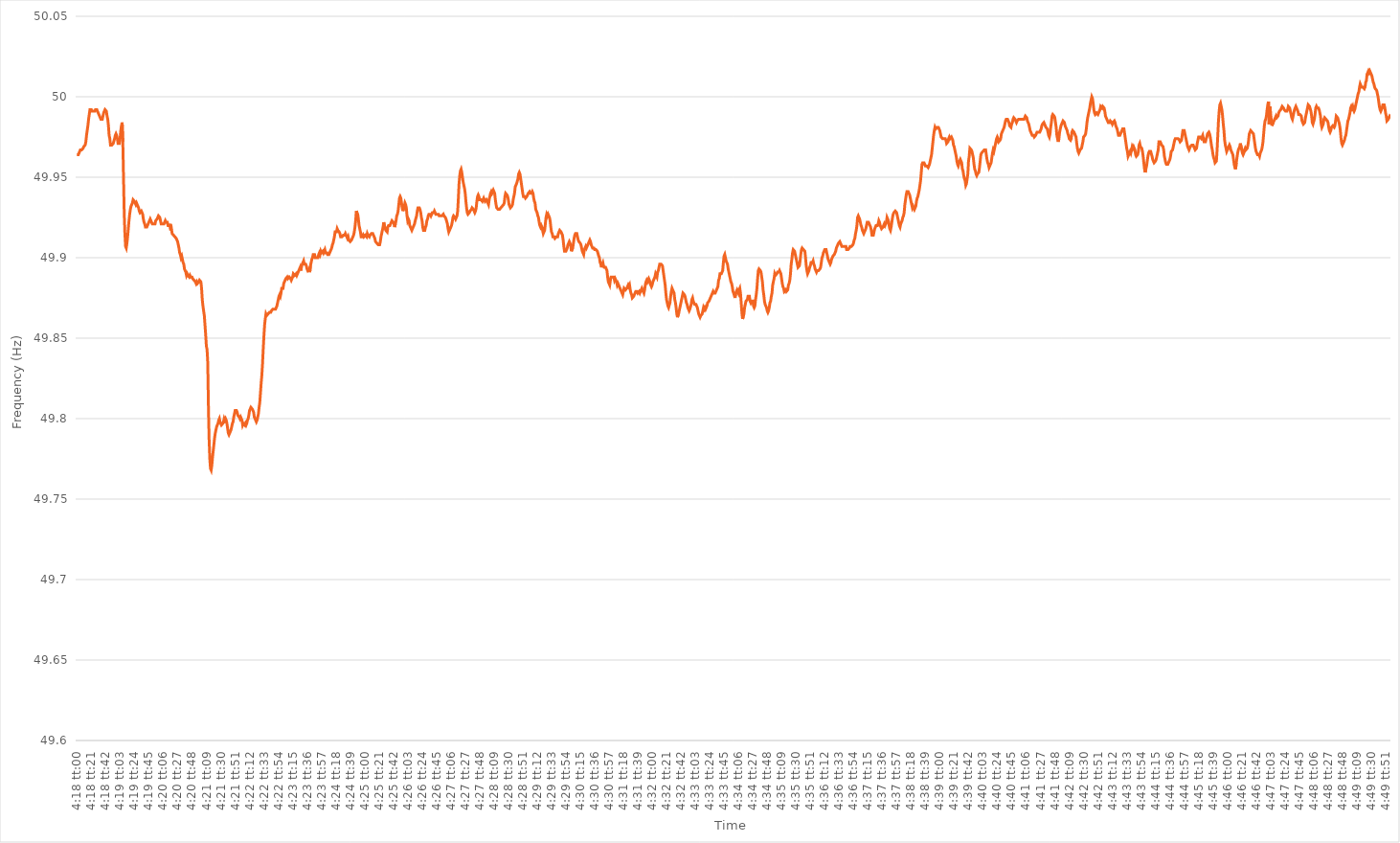
| Category | Series 0 |
|---|---|
| 0.17916666666666667 | 49.964 |
| 0.17917824074074074 | 49.964 |
| 0.1791898148148148 | 49.964 |
| 0.1792013888888889 | 49.965 |
| 0.17921296296296296 | 49.966 |
| 0.17922453703703703 | 49.967 |
| 0.17923611111111112 | 49.967 |
| 0.1792476851851852 | 49.967 |
| 0.17925925925925926 | 49.967 |
| 0.17927083333333335 | 49.968 |
| 0.17928240740740742 | 49.969 |
| 0.17929398148148148 | 49.969 |
| 0.17930555555555558 | 49.97 |
| 0.17931712962962965 | 49.972 |
| 0.1793287037037037 | 49.976 |
| 0.17934027777777775 | 49.979 |
| 0.17935185185185185 | 49.982 |
| 0.1793634259259259 | 49.986 |
| 0.17937499999999998 | 49.989 |
| 0.17938657407407407 | 49.992 |
| 0.17939814814814814 | 49.992 |
| 0.1794097222222222 | 49.992 |
| 0.1794212962962963 | 49.991 |
| 0.17943287037037037 | 49.991 |
| 0.17944444444444443 | 49.991 |
| 0.17945601851851853 | 49.991 |
| 0.1794675925925926 | 49.991 |
| 0.17947916666666666 | 49.992 |
| 0.17949074074074076 | 49.992 |
| 0.17950231481481482 | 49.992 |
| 0.1795138888888889 | 49.991 |
| 0.17952546296296298 | 49.99 |
| 0.17953703703703705 | 49.989 |
| 0.17954861111111112 | 49.988 |
| 0.1795601851851852 | 49.987 |
| 0.17957175925925925 | 49.986 |
| 0.17958333333333332 | 49.986 |
| 0.17959490740740738 | 49.986 |
| 0.17960648148148148 | 49.988 |
| 0.17961805555555554 | 49.99 |
| 0.1796296296296296 | 49.991 |
| 0.1796412037037037 | 49.992 |
| 0.17965277777777777 | 49.992 |
| 0.17966435185185184 | 49.991 |
| 0.17967592592592593 | 49.988 |
| 0.1796875 | 49.986 |
| 0.17969907407407407 | 49.982 |
| 0.17971064814814816 | 49.976 |
| 0.17972222222222223 | 49.974 |
| 0.1797337962962963 | 49.97 |
| 0.1797453703703704 | 49.97 |
| 0.17975694444444446 | 49.97 |
| 0.17976851851851852 | 49.97 |
| 0.17978009259259262 | 49.971 |
| 0.17979166666666668 | 49.971 |
| 0.17980324074074075 | 49.974 |
| 0.1798148148148148 | 49.976 |
| 0.17982638888888888 | 49.977 |
| 0.17983796296296295 | 49.976 |
| 0.17984953703703702 | 49.974 |
| 0.1798611111111111 | 49.971 |
| 0.17987268518518518 | 49.971 |
| 0.17988425925925924 | 49.971 |
| 0.17989583333333334 | 49.974 |
| 0.1799074074074074 | 49.979 |
| 0.17991898148148147 | 49.982 |
| 0.17993055555555557 | 49.984 |
| 0.17994212962962963 | 49.972 |
| 0.1799537037037037 | 49.95 |
| 0.1799652777777778 | 49.928 |
| 0.17997685185185186 | 49.915 |
| 0.17998842592592593 | 49.907 |
| 0.18000000000000002 | 49.906 |
| 0.1800115740740741 | 49.909 |
| 0.18002314814814815 | 49.913 |
| 0.18003472222222225 | 49.918 |
| 0.1800462962962963 | 49.923 |
| 0.18005787037037035 | 49.927 |
| 0.18006944444444442 | 49.93 |
| 0.18008101851851852 | 49.932 |
| 0.18009259259259258 | 49.933 |
| 0.18010416666666665 | 49.934 |
| 0.18011574074074074 | 49.936 |
| 0.1801273148148148 | 49.936 |
| 0.18013888888888888 | 49.935 |
| 0.18015046296296297 | 49.934 |
| 0.18016203703703704 | 49.933 |
| 0.1801736111111111 | 49.934 |
| 0.1801851851851852 | 49.934 |
| 0.18019675925925926 | 49.932 |
| 0.18020833333333333 | 49.931 |
| 0.18021990740740743 | 49.929 |
| 0.1802314814814815 | 49.928 |
| 0.18024305555555556 | 49.928 |
| 0.18025462962962965 | 49.929 |
| 0.18026620370370372 | 49.928 |
| 0.1802777777777778 | 49.927 |
| 0.18028935185185183 | 49.924 |
| 0.18030092592592592 | 49.922 |
| 0.1803125 | 49.921 |
| 0.18032407407407405 | 49.919 |
| 0.18033564814814815 | 49.919 |
| 0.18034722222222221 | 49.919 |
| 0.18035879629629628 | 49.919 |
| 0.18037037037037038 | 49.921 |
| 0.18038194444444444 | 49.922 |
| 0.1803935185185185 | 49.923 |
| 0.1804050925925926 | 49.924 |
| 0.18041666666666667 | 49.923 |
| 0.18042824074074074 | 49.923 |
| 0.18043981481481483 | 49.921 |
| 0.1804513888888889 | 49.921 |
| 0.18046296296296296 | 49.921 |
| 0.18047453703703706 | 49.921 |
| 0.18048611111111112 | 49.921 |
| 0.1804976851851852 | 49.923 |
| 0.18050925925925929 | 49.923 |
| 0.18052083333333332 | 49.924 |
| 0.1805324074074074 | 49.924 |
| 0.18054398148148146 | 49.926 |
| 0.18055555555555555 | 49.926 |
| 0.18056712962962962 | 49.925 |
| 0.18057870370370369 | 49.923 |
| 0.18059027777777778 | 49.921 |
| 0.18060185185185185 | 49.921 |
| 0.1806134259259259 | 49.921 |
| 0.180625 | 49.921 |
| 0.18063657407407407 | 49.921 |
| 0.18064814814814814 | 49.921 |
| 0.18065972222222224 | 49.923 |
| 0.1806712962962963 | 49.922 |
| 0.18068287037037037 | 49.922 |
| 0.18069444444444446 | 49.922 |
| 0.18070601851851853 | 49.92 |
| 0.1807175925925926 | 49.92 |
| 0.1807291666666667 | 49.92 |
| 0.18074074074074076 | 49.921 |
| 0.18075231481481482 | 49.917 |
| 0.18076388888888886 | 49.918 |
| 0.18077546296296296 | 49.915 |
| 0.18078703703703702 | 49.915 |
| 0.1807986111111111 | 49.914 |
| 0.18081018518518518 | 49.914 |
| 0.18082175925925925 | 49.913 |
| 0.18083333333333332 | 49.913 |
| 0.1808449074074074 | 49.912 |
| 0.18085648148148148 | 49.912 |
| 0.18086805555555555 | 49.91 |
| 0.18087962962962964 | 49.908 |
| 0.1808912037037037 | 49.906 |
| 0.18090277777777777 | 49.903 |
| 0.18091435185185187 | 49.902 |
| 0.18092592592592593 | 49.9 |
| 0.1809375 | 49.901 |
| 0.1809490740740741 | 49.899 |
| 0.18096064814814816 | 49.897 |
| 0.18097222222222223 | 49.896 |
| 0.18098379629629632 | 49.893 |
| 0.18099537037037036 | 49.892 |
| 0.18100694444444443 | 49.891 |
| 0.1810185185185185 | 49.889 |
| 0.1810300925925926 | 49.89 |
| 0.18104166666666666 | 49.889 |
| 0.18105324074074072 | 49.889 |
| 0.18106481481481482 | 49.888 |
| 0.18107638888888888 | 49.889 |
| 0.18108796296296295 | 49.888 |
| 0.18109953703703704 | 49.888 |
| 0.1811111111111111 | 49.888 |
| 0.18112268518518518 | 49.887 |
| 0.18113425925925927 | 49.887 |
| 0.18114583333333334 | 49.886 |
| 0.1811574074074074 | 49.886 |
| 0.1811689814814815 | 49.885 |
| 0.18118055555555557 | 49.884 |
| 0.18119212962962963 | 49.885 |
| 0.18120370370370373 | 49.884 |
| 0.1812152777777778 | 49.884 |
| 0.18122685185185183 | 49.885 |
| 0.1812384259259259 | 49.886 |
| 0.18125 | 49.886 |
| 0.18126157407407406 | 49.885 |
| 0.18127314814814813 | 49.881 |
| 0.18128472222222222 | 49.874 |
| 0.1812962962962963 | 49.87 |
| 0.18130787037037036 | 49.867 |
| 0.18131944444444445 | 49.864 |
| 0.18133101851851852 | 49.858 |
| 0.18134259259259258 | 49.852 |
| 0.18135416666666668 | 49.845 |
| 0.18136574074074074 | 49.843 |
| 0.1813773148148148 | 49.835 |
| 0.1813888888888889 | 49.807 |
| 0.18140046296296297 | 49.787 |
| 0.18141203703703704 | 49.775 |
| 0.18142361111111113 | 49.769 |
| 0.1814351851851852 | 49.768 |
| 0.18144675925925927 | 49.771 |
| 0.18145833333333336 | 49.776 |
| 0.1814699074074074 | 49.78 |
| 0.18148148148148147 | 49.784 |
| 0.18149305555555553 | 49.788 |
| 0.18150462962962963 | 49.791 |
| 0.1815162037037037 | 49.793 |
| 0.18152777777777776 | 49.795 |
| 0.18153935185185185 | 49.796 |
| 0.18155092592592592 | 49.797 |
| 0.1815625 | 49.799 |
| 0.18157407407407408 | 49.8 |
| 0.18158564814814815 | 49.798 |
| 0.18159722222222222 | 49.797 |
| 0.1816087962962963 | 49.796 |
| 0.18162037037037038 | 49.796 |
| 0.18163194444444444 | 49.797 |
| 0.18164351851851854 | 49.798 |
| 0.1816550925925926 | 49.8 |
| 0.18166666666666667 | 49.799 |
| 0.18167824074074077 | 49.8 |
| 0.18168981481481483 | 49.799 |
| 0.18170138888888887 | 49.797 |
| 0.18171296296296294 | 49.794 |
| 0.18172453703703703 | 49.791 |
| 0.1817361111111111 | 49.79 |
| 0.18174768518518516 | 49.791 |
| 0.18175925925925926 | 49.791 |
| 0.18177083333333333 | 49.793 |
| 0.1817824074074074 | 49.795 |
| 0.1817939814814815 | 49.797 |
| 0.18180555555555555 | 49.798 |
| 0.18181712962962962 | 49.801 |
| 0.18182870370370371 | 49.803 |
| 0.18184027777777778 | 49.805 |
| 0.18185185185185185 | 49.805 |
| 0.18186342592592594 | 49.805 |
| 0.181875 | 49.804 |
| 0.18188657407407408 | 49.802 |
| 0.18189814814814817 | 49.802 |
| 0.18190972222222224 | 49.801 |
| 0.1819212962962963 | 49.8 |
| 0.1819328703703704 | 49.801 |
| 0.18194444444444444 | 49.8 |
| 0.1819560185185185 | 49.799 |
| 0.18196759259259257 | 49.796 |
| 0.18197916666666666 | 49.797 |
| 0.18199074074074073 | 49.797 |
| 0.1820023148148148 | 49.796 |
| 0.1820138888888889 | 49.797 |
| 0.18202546296296296 | 49.796 |
| 0.18203703703703702 | 49.797 |
| 0.18204861111111112 | 49.799 |
| 0.18206018518518519 | 49.8 |
| 0.18207175925925925 | 49.802 |
| 0.18208333333333335 | 49.805 |
| 0.1820949074074074 | 49.806 |
| 0.18210648148148148 | 49.807 |
| 0.18211805555555557 | 49.807 |
| 0.18212962962962964 | 49.806 |
| 0.1821412037037037 | 49.805 |
| 0.1821527777777778 | 49.804 |
| 0.18216435185185187 | 49.801 |
| 0.1821759259259259 | 49.8 |
| 0.18218749999999997 | 49.799 |
| 0.18219907407407407 | 49.798 |
| 0.18221064814814814 | 49.799 |
| 0.1822222222222222 | 49.801 |
| 0.1822337962962963 | 49.803 |
| 0.18224537037037036 | 49.807 |
| 0.18225694444444443 | 49.81 |
| 0.18226851851851852 | 49.816 |
| 0.1822800925925926 | 49.822 |
| 0.18229166666666666 | 49.827 |
| 0.18230324074074075 | 49.834 |
| 0.18231481481481482 | 49.843 |
| 0.18232638888888889 | 49.851 |
| 0.18233796296296298 | 49.858 |
| 0.18234953703703705 | 49.862 |
| 0.1823611111111111 | 49.865 |
| 0.1823726851851852 | 49.864 |
| 0.18238425925925927 | 49.864 |
| 0.18239583333333334 | 49.865 |
| 0.18240740740740743 | 49.865 |
| 0.18241898148148147 | 49.866 |
| 0.18243055555555554 | 49.866 |
| 0.1824421296296296 | 49.866 |
| 0.1824537037037037 | 49.867 |
| 0.18246527777777777 | 49.867 |
| 0.18247685185185183 | 49.868 |
| 0.18248842592592593 | 49.868 |
| 0.1825 | 49.868 |
| 0.18251157407407406 | 49.868 |
| 0.18252314814814816 | 49.868 |
| 0.18253472222222222 | 49.869 |
| 0.1825462962962963 | 49.87 |
| 0.18255787037037038 | 49.872 |
| 0.18256944444444445 | 49.874 |
| 0.18258101851851852 | 49.876 |
| 0.1825925925925926 | 49.877 |
| 0.18260416666666668 | 49.876 |
| 0.18261574074074075 | 49.878 |
| 0.18262731481481484 | 49.881 |
| 0.1826388888888889 | 49.881 |
| 0.18265046296296295 | 49.881 |
| 0.182662037037037 | 49.884 |
| 0.1826736111111111 | 49.885 |
| 0.18268518518518517 | 49.886 |
| 0.18269675925925924 | 49.887 |
| 0.18270833333333333 | 49.887 |
| 0.1827199074074074 | 49.888 |
| 0.18273148148148147 | 49.887 |
| 0.18274305555555556 | 49.887 |
| 0.18275462962962963 | 49.888 |
| 0.1827662037037037 | 49.888 |
| 0.1827777777777778 | 49.887 |
| 0.18278935185185186 | 49.886 |
| 0.18280092592592592 | 49.887 |
| 0.18281250000000002 | 49.888 |
| 0.18282407407407408 | 49.89 |
| 0.18283564814814815 | 49.89 |
| 0.18284722222222224 | 49.889 |
| 0.1828587962962963 | 49.889 |
| 0.18287037037037038 | 49.89 |
| 0.18288194444444447 | 49.889 |
| 0.1828935185185185 | 49.89 |
| 0.18290509259259258 | 49.89 |
| 0.18291666666666664 | 49.892 |
| 0.18292824074074074 | 49.893 |
| 0.1829398148148148 | 49.894 |
| 0.18295138888888887 | 49.892 |
| 0.18296296296296297 | 49.895 |
| 0.18297453703703703 | 49.896 |
| 0.1829861111111111 | 49.897 |
| 0.1829976851851852 | 49.898 |
| 0.18300925925925926 | 49.896 |
| 0.18302083333333333 | 49.896 |
| 0.18303240740740742 | 49.896 |
| 0.1830439814814815 | 49.895 |
| 0.18305555555555555 | 49.893 |
| 0.18306712962962965 | 49.892 |
| 0.18307870370370372 | 49.892 |
| 0.18309027777777778 | 49.893 |
| 0.18310185185185188 | 49.891 |
| 0.18311342592592594 | 49.895 |
| 0.18312499999999998 | 49.897 |
| 0.18313657407407405 | 49.899 |
| 0.18314814814814814 | 49.9 |
| 0.1831597222222222 | 49.902 |
| 0.18317129629629628 | 49.902 |
| 0.18318287037037037 | 49.902 |
| 0.18319444444444444 | 49.9 |
| 0.1832060185185185 | 49.9 |
| 0.1832175925925926 | 49.9 |
| 0.18322916666666667 | 49.9 |
| 0.18324074074074073 | 49.9 |
| 0.18325231481481483 | 49.902 |
| 0.1832638888888889 | 49.903 |
| 0.18327546296296296 | 49.902 |
| 0.18328703703703705 | 49.904 |
| 0.18329861111111112 | 49.903 |
| 0.1833101851851852 | 49.903 |
| 0.18332175925925928 | 49.904 |
| 0.18333333333333335 | 49.903 |
| 0.18334490740740741 | 49.904 |
| 0.1833564814814815 | 49.905 |
| 0.18336805555555555 | 49.903 |
| 0.18337962962962961 | 49.903 |
| 0.18339120370370368 | 49.903 |
| 0.18340277777777778 | 49.902 |
| 0.18341435185185184 | 49.902 |
| 0.1834259259259259 | 49.902 |
| 0.1834375 | 49.903 |
| 0.18344907407407407 | 49.904 |
| 0.18346064814814814 | 49.905 |
| 0.18347222222222223 | 49.906 |
| 0.1834837962962963 | 49.908 |
| 0.18349537037037036 | 49.909 |
| 0.18350694444444446 | 49.911 |
| 0.18351851851851853 | 49.913 |
| 0.1835300925925926 | 49.916 |
| 0.1835416666666667 | 49.916 |
| 0.18355324074074075 | 49.916 |
| 0.18356481481481482 | 49.918 |
| 0.18357638888888891 | 49.917 |
| 0.18358796296296298 | 49.917 |
| 0.18359953703703702 | 49.916 |
| 0.18361111111111109 | 49.915 |
| 0.18362268518518518 | 49.913 |
| 0.18363425925925925 | 49.913 |
| 0.1836458333333333 | 49.913 |
| 0.1836574074074074 | 49.913 |
| 0.18366898148148147 | 49.914 |
| 0.18368055555555554 | 49.914 |
| 0.18369212962962964 | 49.914 |
| 0.1837037037037037 | 49.915 |
| 0.18371527777777777 | 49.915 |
| 0.18372685185185186 | 49.913 |
| 0.18373842592592593 | 49.912 |
| 0.18375 | 49.913 |
| 0.1837615740740741 | 49.911 |
| 0.18377314814814816 | 49.911 |
| 0.18378472222222222 | 49.91 |
| 0.18379629629629632 | 49.91 |
| 0.18380787037037039 | 49.911 |
| 0.18381944444444445 | 49.911 |
| 0.1838310185185185 | 49.913 |
| 0.18384259259259259 | 49.914 |
| 0.18385416666666665 | 49.916 |
| 0.18386574074074072 | 49.919 |
| 0.1838773148148148 | 49.923 |
| 0.18388888888888888 | 49.929 |
| 0.18390046296296295 | 49.928 |
| 0.18391203703703704 | 49.927 |
| 0.1839236111111111 | 49.924 |
| 0.18393518518518517 | 49.92 |
| 0.18394675925925927 | 49.918 |
| 0.18395833333333333 | 49.916 |
| 0.1839699074074074 | 49.913 |
| 0.1839814814814815 | 49.913 |
| 0.18399305555555556 | 49.913 |
| 0.18400462962962963 | 49.914 |
| 0.18401620370370372 | 49.913 |
| 0.1840277777777778 | 49.913 |
| 0.18403935185185186 | 49.914 |
| 0.18405092592592595 | 49.914 |
| 0.18406250000000002 | 49.913 |
| 0.18407407407407406 | 49.915 |
| 0.18408564814814812 | 49.914 |
| 0.18409722222222222 | 49.914 |
| 0.18410879629629628 | 49.913 |
| 0.18412037037037035 | 49.914 |
| 0.18413194444444445 | 49.914 |
| 0.1841435185185185 | 49.915 |
| 0.18415509259259258 | 49.915 |
| 0.18416666666666667 | 49.915 |
| 0.18417824074074074 | 49.915 |
| 0.1841898148148148 | 49.913 |
| 0.1842013888888889 | 49.912 |
| 0.18421296296296297 | 49.91 |
| 0.18422453703703703 | 49.91 |
| 0.18423611111111113 | 49.909 |
| 0.1842476851851852 | 49.909 |
| 0.18425925925925926 | 49.908 |
| 0.18427083333333336 | 49.908 |
| 0.18428240740740742 | 49.908 |
| 0.1842939814814815 | 49.91 |
| 0.18430555555555553 | 49.913 |
| 0.18431712962962962 | 49.915 |
| 0.1843287037037037 | 49.917 |
| 0.18434027777777776 | 49.919 |
| 0.18435185185185185 | 49.922 |
| 0.18436342592592592 | 49.92 |
| 0.18437499999999998 | 49.92 |
| 0.18438657407407408 | 49.917 |
| 0.18439814814814814 | 49.917 |
| 0.1844097222222222 | 49.916 |
| 0.1844212962962963 | 49.919 |
| 0.18443287037037037 | 49.92 |
| 0.18444444444444444 | 49.92 |
| 0.18445601851851853 | 49.92 |
| 0.1844675925925926 | 49.921 |
| 0.18447916666666667 | 49.922 |
| 0.18449074074074076 | 49.923 |
| 0.18450231481481483 | 49.923 |
| 0.1845138888888889 | 49.922 |
| 0.184525462962963 | 49.921 |
| 0.18453703703703705 | 49.919 |
| 0.1845486111111111 | 49.921 |
| 0.18456018518518516 | 49.923 |
| 0.18457175925925925 | 49.926 |
| 0.18458333333333332 | 49.927 |
| 0.1845949074074074 | 49.929 |
| 0.18460648148148148 | 49.933 |
| 0.18461805555555555 | 49.937 |
| 0.18462962962962962 | 49.938 |
| 0.1846412037037037 | 49.937 |
| 0.18465277777777778 | 49.934 |
| 0.18466435185185184 | 49.931 |
| 0.18467592592592594 | 49.929 |
| 0.1846875 | 49.929 |
| 0.18469907407407407 | 49.932 |
| 0.18471064814814817 | 49.934 |
| 0.18472222222222223 | 49.933 |
| 0.1847337962962963 | 49.931 |
| 0.1847453703703704 | 49.926 |
| 0.18475694444444446 | 49.923 |
| 0.18476851851851853 | 49.924 |
| 0.18478009259259257 | 49.923 |
| 0.18479166666666666 | 49.92 |
| 0.18480324074074073 | 49.919 |
| 0.1848148148148148 | 49.918 |
| 0.1848263888888889 | 49.917 |
| 0.18483796296296295 | 49.918 |
| 0.18484953703703702 | 49.919 |
| 0.18486111111111111 | 49.92 |
| 0.18487268518518518 | 49.921 |
| 0.18488425925925925 | 49.923 |
| 0.18489583333333334 | 49.923 |
| 0.1849074074074074 | 49.926 |
| 0.18491898148148148 | 49.929 |
| 0.18493055555555557 | 49.931 |
| 0.18494212962962964 | 49.931 |
| 0.1849537037037037 | 49.931 |
| 0.1849652777777778 | 49.93 |
| 0.18497685185185186 | 49.928 |
| 0.18498842592592593 | 49.925 |
| 0.18500000000000003 | 49.923 |
| 0.1850115740740741 | 49.919 |
| 0.18502314814814813 | 49.917 |
| 0.1850347222222222 | 49.917 |
| 0.1850462962962963 | 49.917 |
| 0.18505787037037036 | 49.919 |
| 0.18506944444444443 | 49.92 |
| 0.18508101851851852 | 49.923 |
| 0.1850925925925926 | 49.924 |
| 0.18510416666666665 | 49.926 |
| 0.18511574074074075 | 49.927 |
| 0.18512731481481481 | 49.927 |
| 0.18513888888888888 | 49.927 |
| 0.18515046296296298 | 49.926 |
| 0.18516203703703704 | 49.927 |
| 0.1851736111111111 | 49.928 |
| 0.1851851851851852 | 49.928 |
| 0.18519675925925927 | 49.928 |
| 0.18520833333333334 | 49.929 |
| 0.18521990740740743 | 49.928 |
| 0.1852314814814815 | 49.927 |
| 0.18524305555555556 | 49.927 |
| 0.1852546296296296 | 49.927 |
| 0.1852662037037037 | 49.927 |
| 0.18527777777777776 | 49.927 |
| 0.18528935185185183 | 49.926 |
| 0.18530092592592592 | 49.926 |
| 0.1853125 | 49.926 |
| 0.18532407407407406 | 49.926 |
| 0.18533564814814815 | 49.926 |
| 0.18534722222222222 | 49.926 |
| 0.18535879629629629 | 49.927 |
| 0.18537037037037038 | 49.926 |
| 0.18538194444444445 | 49.926 |
| 0.1853935185185185 | 49.925 |
| 0.1854050925925926 | 49.924 |
| 0.18541666666666667 | 49.924 |
| 0.18542824074074074 | 49.921 |
| 0.18543981481481484 | 49.918 |
| 0.1854513888888889 | 49.916 |
| 0.18546296296296297 | 49.917 |
| 0.18547453703703706 | 49.918 |
| 0.18548611111111113 | 49.918 |
| 0.18549768518518517 | 49.92 |
| 0.18550925925925923 | 49.922 |
| 0.18552083333333333 | 49.925 |
| 0.1855324074074074 | 49.926 |
| 0.18554398148148146 | 49.926 |
| 0.18555555555555556 | 49.925 |
| 0.18556712962962962 | 49.924 |
| 0.1855787037037037 | 49.924 |
| 0.18559027777777778 | 49.926 |
| 0.18560185185185185 | 49.929 |
| 0.18561342592592592 | 49.937 |
| 0.185625 | 49.946 |
| 0.18563657407407408 | 49.951 |
| 0.18564814814814815 | 49.954 |
| 0.18565972222222224 | 49.955 |
| 0.1856712962962963 | 49.953 |
| 0.18568287037037037 | 49.95 |
| 0.18569444444444447 | 49.947 |
| 0.18570601851851853 | 49.945 |
| 0.1857175925925926 | 49.943 |
| 0.18572916666666664 | 49.94 |
| 0.18574074074074073 | 49.935 |
| 0.1857523148148148 | 49.931 |
| 0.18576388888888887 | 49.928 |
| 0.18577546296296296 | 49.927 |
| 0.18578703703703703 | 49.927 |
| 0.1857986111111111 | 49.928 |
| 0.1858101851851852 | 49.929 |
| 0.18582175925925926 | 49.929 |
| 0.18583333333333332 | 49.93 |
| 0.18584490740740742 | 49.931 |
| 0.18585648148148148 | 49.931 |
| 0.18586805555555555 | 49.93 |
| 0.18587962962962964 | 49.929 |
| 0.1858912037037037 | 49.928 |
| 0.18590277777777778 | 49.929 |
| 0.18591435185185187 | 49.931 |
| 0.18592592592592594 | 49.935 |
| 0.1859375 | 49.938 |
| 0.1859490740740741 | 49.939 |
| 0.18596064814814817 | 49.938 |
| 0.1859722222222222 | 49.936 |
| 0.18598379629629627 | 49.936 |
| 0.18599537037037037 | 49.936 |
| 0.18600694444444443 | 49.936 |
| 0.1860185185185185 | 49.935 |
| 0.1860300925925926 | 49.936 |
| 0.18604166666666666 | 49.937 |
| 0.18605324074074073 | 49.936 |
| 0.18606481481481482 | 49.935 |
| 0.1860763888888889 | 49.935 |
| 0.18608796296296296 | 49.936 |
| 0.18609953703703705 | 49.935 |
| 0.18611111111111112 | 49.934 |
| 0.18612268518518518 | 49.933 |
| 0.18613425925925928 | 49.936 |
| 0.18614583333333334 | 49.938 |
| 0.1861574074074074 | 49.94 |
| 0.1861689814814815 | 49.941 |
| 0.18618055555555557 | 49.94 |
| 0.18619212962962964 | 49.941 |
| 0.18620370370370368 | 49.942 |
| 0.18621527777777777 | 49.941 |
| 0.18622685185185184 | 49.94 |
| 0.1862384259259259 | 49.936 |
| 0.18625 | 49.933 |
| 0.18626157407407407 | 49.931 |
| 0.18627314814814813 | 49.931 |
| 0.18628472222222223 | 49.93 |
| 0.1862962962962963 | 49.93 |
| 0.18630787037037036 | 49.93 |
| 0.18631944444444445 | 49.93 |
| 0.18633101851851852 | 49.931 |
| 0.1863425925925926 | 49.931 |
| 0.18635416666666668 | 49.932 |
| 0.18636574074074075 | 49.932 |
| 0.18637731481481482 | 49.933 |
| 0.1863888888888889 | 49.934 |
| 0.18640046296296298 | 49.938 |
| 0.18641203703703704 | 49.94 |
| 0.18642361111111114 | 49.94 |
| 0.18643518518518518 | 49.939 |
| 0.18644675925925924 | 49.938 |
| 0.1864583333333333 | 49.936 |
| 0.1864699074074074 | 49.933 |
| 0.18648148148148147 | 49.932 |
| 0.18649305555555554 | 49.931 |
| 0.18650462962962963 | 49.931 |
| 0.1865162037037037 | 49.932 |
| 0.18652777777777776 | 49.933 |
| 0.18653935185185186 | 49.936 |
| 0.18655092592592593 | 49.938 |
| 0.1865625 | 49.94 |
| 0.1865740740740741 | 49.944 |
| 0.18658564814814815 | 49.945 |
| 0.18659722222222222 | 49.946 |
| 0.18660879629629631 | 49.946 |
| 0.18662037037037038 | 49.949 |
| 0.18663194444444445 | 49.952 |
| 0.18664351851851854 | 49.953 |
| 0.1866550925925926 | 49.952 |
| 0.18666666666666668 | 49.949 |
| 0.18667824074074071 | 49.946 |
| 0.1866898148148148 | 49.943 |
| 0.18670138888888888 | 49.94 |
| 0.18671296296296294 | 49.938 |
| 0.18672453703703704 | 49.938 |
| 0.1867361111111111 | 49.938 |
| 0.18674768518518517 | 49.937 |
| 0.18675925925925926 | 49.937 |
| 0.18677083333333333 | 49.938 |
| 0.1867824074074074 | 49.939 |
| 0.1867939814814815 | 49.94 |
| 0.18680555555555556 | 49.94 |
| 0.18681712962962962 | 49.941 |
| 0.18682870370370372 | 49.94 |
| 0.18684027777777779 | 49.94 |
| 0.18685185185185185 | 49.94 |
| 0.18686342592592595 | 49.941 |
| 0.186875 | 49.94 |
| 0.18688657407407408 | 49.937 |
| 0.18689814814814817 | 49.935 |
| 0.1869097222222222 | 49.934 |
| 0.18692129629629628 | 49.93 |
| 0.18693287037037035 | 49.929 |
| 0.18694444444444444 | 49.928 |
| 0.1869560185185185 | 49.926 |
| 0.18696759259259257 | 49.925 |
| 0.18697916666666667 | 49.922 |
| 0.18699074074074074 | 49.92 |
| 0.1870023148148148 | 49.919 |
| 0.1870138888888889 | 49.92 |
| 0.18702546296296296 | 49.919 |
| 0.18703703703703703 | 49.917 |
| 0.18704861111111112 | 49.915 |
| 0.1870601851851852 | 49.915 |
| 0.18707175925925926 | 49.917 |
| 0.18708333333333335 | 49.921 |
| 0.18709490740740742 | 49.925 |
| 0.18710648148148148 | 49.927 |
| 0.18711805555555558 | 49.926 |
| 0.18712962962962965 | 49.927 |
| 0.1871412037037037 | 49.926 |
| 0.18715277777777775 | 49.925 |
| 0.18716435185185185 | 49.923 |
| 0.1871759259259259 | 49.919 |
| 0.18718749999999998 | 49.916 |
| 0.18719907407407407 | 49.915 |
| 0.18721064814814814 | 49.913 |
| 0.1872222222222222 | 49.913 |
| 0.1872337962962963 | 49.913 |
| 0.18724537037037037 | 49.912 |
| 0.18725694444444443 | 49.912 |
| 0.18726851851851853 | 49.913 |
| 0.1872800925925926 | 49.913 |
| 0.18729166666666666 | 49.913 |
| 0.18730324074074076 | 49.915 |
| 0.18731481481481482 | 49.916 |
| 0.1873263888888889 | 49.917 |
| 0.18733796296296298 | 49.917 |
| 0.18734953703703705 | 49.916 |
| 0.18736111111111112 | 49.915 |
| 0.1873726851851852 | 49.914 |
| 0.18738425925925925 | 49.911 |
| 0.18739583333333332 | 49.907 |
| 0.18740740740740738 | 49.904 |
| 0.18741898148148148 | 49.904 |
| 0.18743055555555554 | 49.904 |
| 0.1874421296296296 | 49.905 |
| 0.1874537037037037 | 49.906 |
| 0.18746527777777777 | 49.908 |
| 0.18747685185185184 | 49.909 |
| 0.18748842592592593 | 49.91 |
| 0.1875 | 49.91 |
| 0.18751157407407407 | 49.908 |
| 0.18752314814814816 | 49.904 |
| 0.18753472222222223 | 49.904 |
| 0.1875462962962963 | 49.906 |
| 0.1875578703703704 | 49.909 |
| 0.18756944444444446 | 49.912 |
| 0.18758101851851852 | 49.914 |
| 0.18759259259259262 | 49.915 |
| 0.18760416666666666 | 49.915 |
| 0.18761574074074075 | 49.915 |
| 0.1876273148148148 | 49.913 |
| 0.18763888888888888 | 49.911 |
| 0.18765046296296295 | 49.91 |
| 0.18766203703703702 | 49.91 |
| 0.1876736111111111 | 49.909 |
| 0.18768518518518518 | 49.908 |
| 0.18769675925925924 | 49.906 |
| 0.18770833333333334 | 49.904 |
| 0.1877199074074074 | 49.903 |
| 0.18773148148148147 | 49.902 |
| 0.18774305555555557 | 49.905 |
| 0.18775462962962963 | 49.905 |
| 0.1877662037037037 | 49.907 |
| 0.1877777777777778 | 49.906 |
| 0.18778935185185186 | 49.907 |
| 0.18780092592592593 | 49.907 |
| 0.18781250000000002 | 49.909 |
| 0.1878240740740741 | 49.91 |
| 0.18783564814814815 | 49.911 |
| 0.1878472222222222 | 49.91 |
| 0.18785879629629632 | 49.908 |
| 0.18787037037037035 | 49.907 |
| 0.18788194444444442 | 49.906 |
| 0.18789351851851852 | 49.906 |
| 0.18790509259259258 | 49.906 |
| 0.18791666666666665 | 49.905 |
| 0.18792824074074074 | 49.905 |
| 0.1879398148148148 | 49.905 |
| 0.18795138888888888 | 49.905 |
| 0.18796296296296297 | 49.904 |
| 0.18797453703703704 | 49.904 |
| 0.1879861111111111 | 49.901 |
| 0.1879976851851852 | 49.9 |
| 0.18800925925925926 | 49.897 |
| 0.18802083333333333 | 49.896 |
| 0.18803240740740743 | 49.894 |
| 0.1880439814814815 | 49.896 |
| 0.18805555555555556 | 49.897 |
| 0.18806712962962965 | 49.895 |
| 0.18807870370370372 | 49.894 |
| 0.18809027777777776 | 49.894 |
| 0.18810185185185188 | 49.894 |
| 0.18811342592592592 | 49.893 |
| 0.188125 | 49.892 |
| 0.18813657407407405 | 49.888 |
| 0.18814814814814815 | 49.885 |
| 0.18815972222222221 | 49.884 |
| 0.18817129629629628 | 49.883 |
| 0.18818287037037038 | 49.886 |
| 0.18819444444444444 | 49.888 |
| 0.1882060185185185 | 49.888 |
| 0.1882175925925926 | 49.888 |
| 0.18822916666666667 | 49.888 |
| 0.18824074074074074 | 49.888 |
| 0.18825231481481483 | 49.886 |
| 0.1882638888888889 | 49.887 |
| 0.18827546296296296 | 49.886 |
| 0.18828703703703706 | 49.885 |
| 0.18829861111111112 | 49.883 |
| 0.1883101851851852 | 49.884 |
| 0.18832175925925929 | 49.883 |
| 0.18833333333333332 | 49.882 |
| 0.1883449074074074 | 49.881 |
| 0.18835648148148146 | 49.88 |
| 0.18836805555555555 | 49.879 |
| 0.18837962962962962 | 49.879 |
| 0.18839120370370369 | 49.877 |
| 0.18840277777777778 | 49.879 |
| 0.18841435185185185 | 49.881 |
| 0.1884259259259259 | 49.881 |
| 0.1884375 | 49.88 |
| 0.18844907407407407 | 49.88 |
| 0.18846064814814814 | 49.881 |
| 0.18847222222222224 | 49.882 |
| 0.1884837962962963 | 49.883 |
| 0.18849537037037037 | 49.882 |
| 0.18850694444444446 | 49.883 |
| 0.18851851851851853 | 49.88 |
| 0.1885300925925926 | 49.878 |
| 0.1885416666666667 | 49.877 |
| 0.18855324074074073 | 49.875 |
| 0.18856481481481482 | 49.875 |
| 0.18857638888888886 | 49.876 |
| 0.18858796296296296 | 49.877 |
| 0.18859953703703702 | 49.877 |
| 0.1886111111111111 | 49.879 |
| 0.18862268518518518 | 49.879 |
| 0.18863425925925925 | 49.879 |
| 0.18864583333333332 | 49.878 |
| 0.1886574074074074 | 49.878 |
| 0.18866898148148148 | 49.879 |
| 0.18868055555555555 | 49.878 |
| 0.18869212962962964 | 49.879 |
| 0.1887037037037037 | 49.88 |
| 0.18871527777777777 | 49.881 |
| 0.18872685185185187 | 49.88 |
| 0.18873842592592593 | 49.879 |
| 0.18875 | 49.878 |
| 0.1887615740740741 | 49.88 |
| 0.18877314814814816 | 49.883 |
| 0.18878472222222223 | 49.885 |
| 0.18879629629629627 | 49.886 |
| 0.1888078703703704 | 49.885 |
| 0.18881944444444443 | 49.886 |
| 0.1888310185185185 | 49.887 |
| 0.1888425925925926 | 49.886 |
| 0.18885416666666666 | 49.884 |
| 0.18886574074074072 | 49.884 |
| 0.18887731481481482 | 49.882 |
| 0.18888888888888888 | 49.883 |
| 0.18890046296296295 | 49.885 |
| 0.18891203703703704 | 49.886 |
| 0.1889236111111111 | 49.887 |
| 0.18893518518518518 | 49.888 |
| 0.18894675925925927 | 49.89 |
| 0.18895833333333334 | 49.889 |
| 0.1889699074074074 | 49.888 |
| 0.1889814814814815 | 49.891 |
| 0.18899305555555557 | 49.892 |
| 0.18900462962962963 | 49.894 |
| 0.18901620370370367 | 49.896 |
| 0.1890277777777778 | 49.896 |
| 0.18903935185185183 | 49.896 |
| 0.18905092592592596 | 49.896 |
| 0.1890625 | 49.895 |
| 0.18907407407407406 | 49.892 |
| 0.18908564814814813 | 49.889 |
| 0.18909722222222222 | 49.886 |
| 0.1891087962962963 | 49.883 |
| 0.18912037037037036 | 49.878 |
| 0.18913194444444445 | 49.874 |
| 0.18914351851851852 | 49.872 |
| 0.18915509259259258 | 49.87 |
| 0.18916666666666668 | 49.869 |
| 0.18917824074074074 | 49.869 |
| 0.1891898148148148 | 49.872 |
| 0.1892013888888889 | 49.876 |
| 0.18921296296296297 | 49.879 |
| 0.18922453703703704 | 49.881 |
| 0.18923611111111113 | 49.88 |
| 0.1892476851851852 | 49.879 |
| 0.18925925925925924 | 49.878 |
| 0.18927083333333336 | 49.874 |
| 0.1892824074074074 | 49.872 |
| 0.1892939814814815 | 49.869 |
| 0.18930555555555553 | 49.865 |
| 0.18931712962962963 | 49.863 |
| 0.1893287037037037 | 49.863 |
| 0.18934027777777776 | 49.866 |
| 0.18935185185185185 | 49.868 |
| 0.18936342592592592 | 49.87 |
| 0.189375 | 49.872 |
| 0.18938657407407408 | 49.874 |
| 0.18939814814814815 | 49.876 |
| 0.18940972222222222 | 49.878 |
| 0.1894212962962963 | 49.878 |
| 0.18943287037037038 | 49.877 |
| 0.18944444444444444 | 49.876 |
| 0.18945601851851854 | 49.874 |
| 0.1894675925925926 | 49.872 |
| 0.18947916666666667 | 49.871 |
| 0.18949074074074077 | 49.869 |
| 0.1895023148148148 | 49.868 |
| 0.1895138888888889 | 49.867 |
| 0.18952546296296294 | 49.868 |
| 0.18953703703703703 | 49.868 |
| 0.1895486111111111 | 49.871 |
| 0.18956018518518516 | 49.874 |
| 0.18957175925925926 | 49.875 |
| 0.18958333333333333 | 49.873 |
| 0.1895949074074074 | 49.872 |
| 0.1896064814814815 | 49.871 |
| 0.18961805555555555 | 49.871 |
| 0.18962962962962962 | 49.871 |
| 0.18964120370370371 | 49.87 |
| 0.18965277777777778 | 49.869 |
| 0.18966435185185185 | 49.867 |
| 0.18967592592592594 | 49.865 |
| 0.1896875 | 49.864 |
| 0.18969907407407408 | 49.863 |
| 0.18971064814814817 | 49.864 |
| 0.18972222222222224 | 49.864 |
| 0.1897337962962963 | 49.865 |
| 0.18974537037037034 | 49.867 |
| 0.18975694444444446 | 49.869 |
| 0.1897685185185185 | 49.868 |
| 0.18978009259259257 | 49.869 |
| 0.18979166666666666 | 49.868 |
| 0.18980324074074073 | 49.869 |
| 0.1898148148148148 | 49.87 |
| 0.1898263888888889 | 49.872 |
| 0.18983796296296296 | 49.872 |
| 0.18984953703703702 | 49.873 |
| 0.18986111111111112 | 49.874 |
| 0.18987268518518519 | 49.875 |
| 0.18988425925925925 | 49.876 |
| 0.18989583333333335 | 49.877 |
| 0.1899074074074074 | 49.878 |
| 0.18991898148148148 | 49.879 |
| 0.18993055555555557 | 49.878 |
| 0.18994212962962964 | 49.878 |
| 0.1899537037037037 | 49.878 |
| 0.18996527777777775 | 49.879 |
| 0.18997685185185187 | 49.879 |
| 0.1899884259259259 | 49.881 |
| 0.19000000000000003 | 49.882 |
| 0.19001157407407407 | 49.886 |
| 0.19002314814814814 | 49.887 |
| 0.1900347222222222 | 49.89 |
| 0.1900462962962963 | 49.89 |
| 0.19005787037037036 | 49.89 |
| 0.19006944444444443 | 49.891 |
| 0.19008101851851852 | 49.892 |
| 0.1900925925925926 | 49.897 |
| 0.19010416666666666 | 49.901 |
| 0.19011574074074075 | 49.902 |
| 0.19012731481481482 | 49.9 |
| 0.19013888888888889 | 49.898 |
| 0.19015046296296298 | 49.897 |
| 0.19016203703703705 | 49.896 |
| 0.1901736111111111 | 49.893 |
| 0.1901851851851852 | 49.891 |
| 0.19019675925925927 | 49.889 |
| 0.1902083333333333 | 49.887 |
| 0.19021990740740743 | 49.885 |
| 0.19023148148148147 | 49.884 |
| 0.19024305555555557 | 49.882 |
| 0.1902546296296296 | 49.879 |
| 0.1902662037037037 | 49.878 |
| 0.19027777777777777 | 49.878 |
| 0.19028935185185183 | 49.875 |
| 0.19030092592592593 | 49.878 |
| 0.1903125 | 49.879 |
| 0.19032407407407406 | 49.88 |
| 0.19033564814814816 | 49.879 |
| 0.19034722222222222 | 49.878 |
| 0.1903587962962963 | 49.88 |
| 0.19037037037037038 | 49.881 |
| 0.19038194444444445 | 49.878 |
| 0.19039351851851852 | 49.872 |
| 0.1904050925925926 | 49.866 |
| 0.19041666666666668 | 49.862 |
| 0.19042824074074075 | 49.863 |
| 0.19043981481481484 | 49.865 |
| 0.19045138888888888 | 49.869 |
| 0.19046296296296297 | 49.871 |
| 0.190474537037037 | 49.873 |
| 0.1904861111111111 | 49.873 |
| 0.19049768518518517 | 49.874 |
| 0.19050925925925924 | 49.876 |
| 0.19052083333333333 | 49.876 |
| 0.1905324074074074 | 49.876 |
| 0.19054398148148147 | 49.873 |
| 0.19055555555555556 | 49.872 |
| 0.19056712962962963 | 49.873 |
| 0.1905787037037037 | 49.873 |
| 0.1905902777777778 | 49.873 |
| 0.19060185185185186 | 49.87 |
| 0.19061342592592592 | 49.869 |
| 0.19062500000000002 | 49.87 |
| 0.19063657407407408 | 49.874 |
| 0.19064814814814815 | 49.877 |
| 0.19065972222222224 | 49.881 |
| 0.1906712962962963 | 49.887 |
| 0.19068287037037038 | 49.892 |
| 0.19069444444444442 | 49.893 |
| 0.19070601851851854 | 49.893 |
| 0.19071759259259258 | 49.892 |
| 0.19072916666666664 | 49.891 |
| 0.19074074074074074 | 49.888 |
| 0.1907523148148148 | 49.885 |
| 0.19076388888888887 | 49.88 |
| 0.19077546296296297 | 49.877 |
| 0.19078703703703703 | 49.873 |
| 0.1907986111111111 | 49.871 |
| 0.1908101851851852 | 49.87 |
| 0.19082175925925926 | 49.869 |
| 0.19083333333333333 | 49.867 |
| 0.19084490740740742 | 49.866 |
| 0.1908564814814815 | 49.867 |
| 0.19086805555555555 | 49.869 |
| 0.19087962962962965 | 49.872 |
| 0.19089120370370372 | 49.873 |
| 0.19090277777777778 | 49.876 |
| 0.19091435185185182 | 49.878 |
| 0.19092592592592594 | 49.883 |
| 0.19093749999999998 | 49.885 |
| 0.1909490740740741 | 49.887 |
| 0.19096064814814814 | 49.89 |
| 0.1909722222222222 | 49.889 |
| 0.19098379629629628 | 49.889 |
| 0.19099537037037037 | 49.89 |
| 0.19100694444444444 | 49.891 |
| 0.1910185185185185 | 49.891 |
| 0.1910300925925926 | 49.891 |
| 0.19104166666666667 | 49.892 |
| 0.19105324074074073 | 49.892 |
| 0.19106481481481483 | 49.89 |
| 0.1910763888888889 | 49.887 |
| 0.19108796296296296 | 49.884 |
| 0.19109953703703705 | 49.882 |
| 0.19111111111111112 | 49.881 |
| 0.1911226851851852 | 49.879 |
| 0.19113425925925928 | 49.879 |
| 0.19114583333333335 | 49.88 |
| 0.1911574074074074 | 49.879 |
| 0.1911689814814815 | 49.879 |
| 0.19118055555555555 | 49.88 |
| 0.19119212962962964 | 49.883 |
| 0.19120370370370368 | 49.884 |
| 0.19121527777777778 | 49.886 |
| 0.19122685185185184 | 49.89 |
| 0.1912384259259259 | 49.896 |
| 0.19125 | 49.899 |
| 0.19126157407407407 | 49.903 |
| 0.19127314814814814 | 49.905 |
| 0.19128472222222223 | 49.905 |
| 0.1912962962962963 | 49.904 |
| 0.19130787037037036 | 49.902 |
| 0.19131944444444446 | 49.9 |
| 0.19133101851851853 | 49.898 |
| 0.1913425925925926 | 49.896 |
| 0.1913541666666667 | 49.894 |
| 0.19136574074074075 | 49.894 |
| 0.19137731481481482 | 49.895 |
| 0.19138888888888891 | 49.898 |
| 0.19140046296296295 | 49.902 |
| 0.19141203703703705 | 49.905 |
| 0.19142361111111109 | 49.906 |
| 0.19143518518518518 | 49.906 |
| 0.19144675925925925 | 49.905 |
| 0.1914583333333333 | 49.905 |
| 0.1914699074074074 | 49.904 |
| 0.19148148148148147 | 49.9 |
| 0.19149305555555554 | 49.895 |
| 0.19150462962962964 | 49.892 |
| 0.1915162037037037 | 49.89 |
| 0.19152777777777777 | 49.89 |
| 0.19153935185185186 | 49.892 |
| 0.19155092592592593 | 49.894 |
| 0.1915625 | 49.895 |
| 0.1915740740740741 | 49.897 |
| 0.19158564814814816 | 49.897 |
| 0.19159722222222222 | 49.897 |
| 0.19160879629629632 | 49.898 |
| 0.19162037037037036 | 49.896 |
| 0.19163194444444445 | 49.895 |
| 0.1916435185185185 | 49.893 |
| 0.1916550925925926 | 49.893 |
| 0.19166666666666665 | 49.891 |
| 0.19167824074074072 | 49.892 |
| 0.1916898148148148 | 49.892 |
| 0.19170138888888888 | 49.892 |
| 0.19171296296296295 | 49.892 |
| 0.19172453703703704 | 49.893 |
| 0.1917361111111111 | 49.894 |
| 0.19174768518518517 | 49.897 |
| 0.19175925925925927 | 49.9 |
| 0.19177083333333333 | 49.901 |
| 0.1917824074074074 | 49.903 |
| 0.1917939814814815 | 49.904 |
| 0.19180555555555556 | 49.905 |
| 0.19181712962962963 | 49.905 |
| 0.19182870370370372 | 49.905 |
| 0.1918402777777778 | 49.903 |
| 0.19185185185185186 | 49.901 |
| 0.1918634259259259 | 49.899 |
| 0.19187500000000002 | 49.898 |
| 0.19188657407407406 | 49.897 |
| 0.19189814814814818 | 49.896 |
| 0.19190972222222222 | 49.897 |
| 0.19192129629629628 | 49.899 |
| 0.19193287037037035 | 49.899 |
| 0.19194444444444445 | 49.901 |
| 0.1919560185185185 | 49.901 |
| 0.19196759259259258 | 49.902 |
| 0.19197916666666667 | 49.903 |
| 0.19199074074074074 | 49.904 |
| 0.1920023148148148 | 49.906 |
| 0.1920138888888889 | 49.907 |
| 0.19202546296296297 | 49.908 |
| 0.19203703703703703 | 49.909 |
| 0.19204861111111113 | 49.909 |
| 0.1920601851851852 | 49.91 |
| 0.19207175925925926 | 49.909 |
| 0.19208333333333336 | 49.908 |
| 0.19209490740740742 | 49.907 |
| 0.19210648148148146 | 49.907 |
| 0.19211805555555558 | 49.907 |
| 0.19212962962962962 | 49.907 |
| 0.1921412037037037 | 49.907 |
| 0.19215277777777776 | 49.907 |
| 0.19216435185185185 | 49.907 |
| 0.19217592592592592 | 49.905 |
| 0.19218749999999998 | 49.905 |
| 0.19219907407407408 | 49.905 |
| 0.19221064814814814 | 49.905 |
| 0.1922222222222222 | 49.906 |
| 0.1922337962962963 | 49.907 |
| 0.19224537037037037 | 49.907 |
| 0.19225694444444444 | 49.907 |
| 0.19226851851851853 | 49.907 |
| 0.1922800925925926 | 49.908 |
| 0.19229166666666667 | 49.909 |
| 0.19230324074074076 | 49.911 |
| 0.19231481481481483 | 49.912 |
| 0.1923263888888889 | 49.915 |
| 0.192337962962963 | 49.917 |
| 0.19234953703703703 | 49.92 |
| 0.19236111111111112 | 49.925 |
| 0.19237268518518516 | 49.926 |
| 0.19238425925925925 | 49.926 |
| 0.19239583333333332 | 49.924 |
| 0.1924074074074074 | 49.922 |
| 0.19241898148148148 | 49.92 |
| 0.19243055555555555 | 49.919 |
| 0.19244212962962962 | 49.917 |
| 0.1924537037037037 | 49.916 |
| 0.19246527777777778 | 49.915 |
| 0.19247685185185184 | 49.916 |
| 0.19248842592592594 | 49.917 |
| 0.1925 | 49.918 |
| 0.19251157407407407 | 49.92 |
| 0.19252314814814817 | 49.922 |
| 0.19253472222222223 | 49.922 |
| 0.1925462962962963 | 49.922 |
| 0.1925578703703704 | 49.921 |
| 0.19256944444444443 | 49.92 |
| 0.19258101851851853 | 49.919 |
| 0.19259259259259257 | 49.917 |
| 0.1926041666666667 | 49.914 |
| 0.19261574074074073 | 49.914 |
| 0.1926273148148148 | 49.914 |
| 0.1926388888888889 | 49.916 |
| 0.19265046296296295 | 49.918 |
| 0.19266203703703702 | 49.919 |
| 0.19267361111111111 | 49.92 |
| 0.19268518518518518 | 49.92 |
| 0.19269675925925925 | 49.92 |
| 0.19270833333333334 | 49.921 |
| 0.1927199074074074 | 49.923 |
| 0.19273148148148148 | 49.922 |
| 0.19274305555555557 | 49.92 |
| 0.19275462962962964 | 49.919 |
| 0.1927662037037037 | 49.918 |
| 0.1927777777777778 | 49.918 |
| 0.19278935185185186 | 49.919 |
| 0.19280092592592593 | 49.92 |
| 0.19281249999999997 | 49.921 |
| 0.1928240740740741 | 49.92 |
| 0.19283564814814813 | 49.92 |
| 0.19284722222222225 | 49.922 |
| 0.1928587962962963 | 49.925 |
| 0.19287037037037036 | 49.925 |
| 0.19288194444444443 | 49.923 |
| 0.19289351851851852 | 49.92 |
| 0.1929050925925926 | 49.918 |
| 0.19291666666666665 | 49.917 |
| 0.19292824074074075 | 49.919 |
| 0.19293981481481481 | 49.922 |
| 0.19295138888888888 | 49.925 |
| 0.19296296296296298 | 49.927 |
| 0.19297453703703704 | 49.928 |
| 0.1929861111111111 | 49.928 |
| 0.1929976851851852 | 49.929 |
| 0.19300925925925927 | 49.929 |
| 0.19302083333333334 | 49.928 |
| 0.19303240740740743 | 49.926 |
| 0.1930439814814815 | 49.924 |
| 0.19305555555555554 | 49.922 |
| 0.19306712962962966 | 49.92 |
| 0.1930787037037037 | 49.919 |
| 0.19309027777777776 | 49.921 |
| 0.19310185185185183 | 49.922 |
| 0.19311342592592592 | 49.923 |
| 0.193125 | 49.925 |
| 0.19313657407407406 | 49.926 |
| 0.19314814814814815 | 49.928 |
| 0.19315972222222222 | 49.933 |
| 0.19317129629629629 | 49.936 |
| 0.19318287037037038 | 49.939 |
| 0.19319444444444445 | 49.941 |
| 0.1932060185185185 | 49.941 |
| 0.1932175925925926 | 49.941 |
| 0.19322916666666667 | 49.941 |
| 0.19324074074074074 | 49.939 |
| 0.19325231481481484 | 49.937 |
| 0.1932638888888889 | 49.935 |
| 0.19327546296296297 | 49.933 |
| 0.19328703703703706 | 49.931 |
| 0.1932986111111111 | 49.932 |
| 0.1933101851851852 | 49.931 |
| 0.19332175925925923 | 49.93 |
| 0.19333333333333333 | 49.93 |
| 0.1933449074074074 | 49.932 |
| 0.19335648148148146 | 49.935 |
| 0.19336805555555556 | 49.937 |
| 0.19337962962962962 | 49.938 |
| 0.1933912037037037 | 49.94 |
| 0.19340277777777778 | 49.942 |
| 0.19341435185185185 | 49.945 |
| 0.19342592592592592 | 49.948 |
| 0.1934375 | 49.953 |
| 0.19344907407407408 | 49.958 |
| 0.19346064814814815 | 49.959 |
| 0.19347222222222224 | 49.959 |
| 0.1934837962962963 | 49.959 |
| 0.19349537037037037 | 49.958 |
| 0.19350694444444447 | 49.957 |
| 0.1935185185185185 | 49.957 |
| 0.1935300925925926 | 49.957 |
| 0.19354166666666664 | 49.957 |
| 0.19355324074074076 | 49.956 |
| 0.1935648148148148 | 49.956 |
| 0.19357638888888887 | 49.958 |
| 0.19358796296296296 | 49.96 |
| 0.19359953703703703 | 49.962 |
| 0.1936111111111111 | 49.964 |
| 0.1936226851851852 | 49.968 |
| 0.19363425925925926 | 49.972 |
| 0.19364583333333332 | 49.976 |
| 0.19365740740740742 | 49.979 |
| 0.19366898148148148 | 49.981 |
| 0.19368055555555555 | 49.98 |
| 0.19369212962962964 | 49.98 |
| 0.1937037037037037 | 49.981 |
| 0.19371527777777778 | 49.981 |
| 0.19372685185185187 | 49.981 |
| 0.19373842592592594 | 49.98 |
| 0.19375 | 49.979 |
| 0.19376157407407404 | 49.977 |
| 0.19377314814814817 | 49.975 |
| 0.1937847222222222 | 49.975 |
| 0.19379629629629633 | 49.974 |
| 0.19380787037037037 | 49.974 |
| 0.19381944444444443 | 49.974 |
| 0.1938310185185185 | 49.974 |
| 0.1938425925925926 | 49.974 |
| 0.19385416666666666 | 49.973 |
| 0.19386574074074073 | 49.971 |
| 0.19387731481481482 | 49.971 |
| 0.1938888888888889 | 49.972 |
| 0.19390046296296296 | 49.974 |
| 0.19391203703703705 | 49.975 |
| 0.19392361111111112 | 49.974 |
| 0.19393518518518518 | 49.974 |
| 0.19394675925925928 | 49.975 |
| 0.19395833333333334 | 49.974 |
| 0.1939699074074074 | 49.973 |
| 0.1939814814814815 | 49.97 |
| 0.19399305555555557 | 49.969 |
| 0.1940046296296296 | 49.967 |
| 0.19401620370370373 | 49.965 |
| 0.19402777777777777 | 49.963 |
| 0.19403935185185184 | 49.96 |
| 0.1940509259259259 | 49.958 |
| 0.1940625 | 49.957 |
| 0.19407407407407407 | 49.957 |
| 0.19408564814814813 | 49.96 |
| 0.19409722222222223 | 49.961 |
| 0.1941087962962963 | 49.96 |
| 0.19412037037037036 | 49.959 |
| 0.19413194444444445 | 49.955 |
| 0.19414351851851852 | 49.954 |
| 0.1941550925925926 | 49.951 |
| 0.19416666666666668 | 49.949 |
| 0.19417824074074075 | 49.948 |
| 0.19418981481481482 | 49.945 |
| 0.1942013888888889 | 49.946 |
| 0.19421296296296298 | 49.949 |
| 0.19422453703703701 | 49.952 |
| 0.19423611111111114 | 49.96 |
| 0.19424768518518518 | 49.963 |
| 0.19425925925925927 | 49.968 |
| 0.1942708333333333 | 49.968 |
| 0.1942824074074074 | 49.967 |
| 0.19429398148148147 | 49.966 |
| 0.19430555555555554 | 49.964 |
| 0.19431712962962963 | 49.962 |
| 0.1943287037037037 | 49.958 |
| 0.19434027777777776 | 49.955 |
| 0.19435185185185186 | 49.954 |
| 0.19436342592592593 | 49.952 |
| 0.194375 | 49.951 |
| 0.1943865740740741 | 49.952 |
| 0.19439814814814815 | 49.952 |
| 0.19440972222222222 | 49.953 |
| 0.19442129629629631 | 49.956 |
| 0.19443287037037038 | 49.96 |
| 0.19444444444444445 | 49.964 |
| 0.19445601851851854 | 49.965 |
| 0.19446759259259258 | 49.965 |
| 0.19447916666666668 | 49.966 |
| 0.19449074074074071 | 49.966 |
| 0.19450231481481484 | 49.967 |
| 0.19451388888888888 | 49.967 |
| 0.19452546296296294 | 49.967 |
| 0.19453703703703704 | 49.964 |
| 0.1945486111111111 | 49.961 |
| 0.19456018518518517 | 49.959 |
| 0.19457175925925926 | 49.958 |
| 0.19458333333333333 | 49.956 |
| 0.1945949074074074 | 49.957 |
| 0.1946064814814815 | 49.958 |
| 0.19461805555555556 | 49.959 |
| 0.19462962962962962 | 49.962 |
| 0.19464120370370372 | 49.965 |
| 0.19465277777777779 | 49.967 |
| 0.19466435185185185 | 49.966 |
| 0.19467592592592595 | 49.968 |
| 0.1946875 | 49.97 |
| 0.19469907407407408 | 49.972 |
| 0.19471064814814812 | 49.974 |
| 0.19472222222222224 | 49.975 |
| 0.19473379629629628 | 49.974 |
| 0.19474537037037035 | 49.972 |
| 0.19475694444444444 | 49.972 |
| 0.1947685185185185 | 49.973 |
| 0.19478009259259257 | 49.974 |
| 0.19479166666666667 | 49.977 |
| 0.19480324074074074 | 49.978 |
| 0.1948148148148148 | 49.979 |
| 0.1948263888888889 | 49.98 |
| 0.19483796296296296 | 49.981 |
| 0.19484953703703703 | 49.983 |
| 0.19486111111111112 | 49.985 |
| 0.1948726851851852 | 49.986 |
| 0.19488425925925926 | 49.986 |
| 0.19489583333333335 | 49.986 |
| 0.19490740740740742 | 49.985 |
| 0.19491898148148148 | 49.984 |
| 0.19493055555555558 | 49.982 |
| 0.19494212962962965 | 49.982 |
| 0.19495370370370368 | 49.981 |
| 0.1949652777777778 | 49.983 |
| 0.19497685185185185 | 49.984 |
| 0.1949884259259259 | 49.986 |
| 0.19499999999999998 | 49.987 |
| 0.19501157407407407 | 49.987 |
| 0.19502314814814814 | 49.986 |
| 0.1950347222222222 | 49.985 |
| 0.1950462962962963 | 49.984 |
| 0.19505787037037037 | 49.985 |
| 0.19506944444444443 | 49.985 |
| 0.19508101851851853 | 49.986 |
| 0.1950925925925926 | 49.986 |
| 0.19510416666666666 | 49.986 |
| 0.19511574074074076 | 49.986 |
| 0.19512731481481482 | 49.986 |
| 0.1951388888888889 | 49.986 |
| 0.19515046296296298 | 49.986 |
| 0.19516203703703705 | 49.986 |
| 0.1951736111111111 | 49.986 |
| 0.1951851851851852 | 49.987 |
| 0.19519675925925925 | 49.988 |
| 0.19520833333333334 | 49.988 |
| 0.19521990740740738 | 49.987 |
| 0.19523148148148148 | 49.985 |
| 0.19524305555555554 | 49.984 |
| 0.1952546296296296 | 49.983 |
| 0.1952662037037037 | 49.981 |
| 0.19527777777777777 | 49.979 |
| 0.19528935185185184 | 49.978 |
| 0.19530092592592593 | 49.977 |
| 0.1953125 | 49.976 |
| 0.19532407407407407 | 49.976 |
| 0.19533564814814816 | 49.976 |
| 0.19534722222222223 | 49.975 |
| 0.1953587962962963 | 49.975 |
| 0.1953703703703704 | 49.976 |
| 0.19538194444444446 | 49.976 |
| 0.19539351851851852 | 49.978 |
| 0.19540509259259262 | 49.978 |
| 0.19541666666666666 | 49.978 |
| 0.19542824074074075 | 49.978 |
| 0.1954398148148148 | 49.978 |
| 0.1954513888888889 | 49.978 |
| 0.19546296296296295 | 49.98 |
| 0.19547453703703702 | 49.982 |
| 0.1954861111111111 | 49.983 |
| 0.19549768518518518 | 49.983 |
| 0.19550925925925924 | 49.984 |
| 0.19552083333333334 | 49.983 |
| 0.1955324074074074 | 49.982 |
| 0.19554398148148147 | 49.981 |
| 0.19555555555555557 | 49.981 |
| 0.19556712962962963 | 49.98 |
| 0.1955787037037037 | 49.978 |
| 0.1955902777777778 | 49.976 |
| 0.19560185185185186 | 49.975 |
| 0.19561342592592593 | 49.977 |
| 0.19562500000000002 | 49.981 |
| 0.1956365740740741 | 49.984 |
| 0.19564814814814815 | 49.988 |
| 0.1956597222222222 | 49.989 |
| 0.19567129629629632 | 49.989 |
| 0.19568287037037035 | 49.988 |
| 0.19569444444444442 | 49.987 |
| 0.19570601851851852 | 49.984 |
| 0.19571759259259258 | 49.981 |
| 0.19572916666666665 | 49.976 |
| 0.19574074074074074 | 49.974 |
| 0.1957523148148148 | 49.972 |
| 0.19576388888888888 | 49.974 |
| 0.19577546296296297 | 49.978 |
| 0.19578703703703704 | 49.98 |
| 0.1957986111111111 | 49.982 |
| 0.1958101851851852 | 49.983 |
| 0.19582175925925926 | 49.984 |
| 0.19583333333333333 | 49.985 |
| 0.19584490740740743 | 49.985 |
| 0.1958564814814815 | 49.984 |
| 0.19586805555555556 | 49.982 |
| 0.19587962962962965 | 49.982 |
| 0.19589120370370372 | 49.98 |
| 0.19590277777777776 | 49.979 |
| 0.19591435185185188 | 49.977 |
| 0.19592592592592592 | 49.976 |
| 0.1959375 | 49.974 |
| 0.19594907407407405 | 49.974 |
| 0.19596064814814815 | 49.973 |
| 0.19597222222222221 | 49.974 |
| 0.19598379629629628 | 49.978 |
| 0.19599537037037038 | 49.979 |
| 0.19600694444444444 | 49.979 |
| 0.1960185185185185 | 49.978 |
| 0.1960300925925926 | 49.977 |
| 0.19604166666666667 | 49.976 |
| 0.19605324074074074 | 49.975 |
| 0.19606481481481483 | 49.971 |
| 0.1960763888888889 | 49.968 |
| 0.19608796296296296 | 49.966 |
| 0.19609953703703706 | 49.965 |
| 0.19611111111111112 | 49.966 |
| 0.19612268518518516 | 49.967 |
| 0.19613425925925929 | 49.967 |
| 0.19614583333333332 | 49.968 |
| 0.19615740740740742 | 49.97 |
| 0.19616898148148146 | 49.972 |
| 0.19618055555555555 | 49.975 |
| 0.19619212962962962 | 49.975 |
| 0.19620370370370369 | 49.976 |
| 0.19621527777777778 | 49.977 |
| 0.19622685185185185 | 49.98 |
| 0.1962384259259259 | 49.984 |
| 0.19625 | 49.987 |
| 0.19626157407407407 | 49.989 |
| 0.19627314814814814 | 49.991 |
| 0.19628472222222224 | 49.993 |
| 0.1962962962962963 | 49.996 |
| 0.19630787037037037 | 49.998 |
| 0.19631944444444446 | 50 |
| 0.19633101851851853 | 49.999 |
| 0.1963425925925926 | 49.996 |
| 0.1963541666666667 | 49.992 |
| 0.19636574074074073 | 49.99 |
| 0.19637731481481482 | 49.989 |
| 0.19638888888888886 | 49.989 |
| 0.19640046296296299 | 49.99 |
| 0.19641203703703702 | 49.99 |
| 0.1964236111111111 | 49.989 |
| 0.19643518518518518 | 49.99 |
| 0.19644675925925925 | 49.991 |
| 0.19645833333333332 | 49.992 |
| 0.1964699074074074 | 49.994 |
| 0.19648148148148148 | 49.994 |
| 0.19649305555555555 | 49.993 |
| 0.19650462962962964 | 49.994 |
| 0.1965162037037037 | 49.994 |
| 0.19652777777777777 | 49.993 |
| 0.19653935185185187 | 49.991 |
| 0.19655092592592593 | 49.988 |
| 0.1965625 | 49.987 |
| 0.1965740740740741 | 49.986 |
| 0.19658564814814816 | 49.985 |
| 0.19659722222222223 | 49.984 |
| 0.19660879629629627 | 49.984 |
| 0.1966203703703704 | 49.984 |
| 0.19663194444444443 | 49.985 |
| 0.1966435185185185 | 49.985 |
| 0.1966550925925926 | 49.984 |
| 0.19666666666666666 | 49.983 |
| 0.19667824074074072 | 49.984 |
| 0.19668981481481482 | 49.984 |
| 0.19670138888888888 | 49.985 |
| 0.19671296296296295 | 49.984 |
| 0.19672453703703704 | 49.982 |
| 0.1967361111111111 | 49.982 |
| 0.19674768518518518 | 49.98 |
| 0.19675925925925927 | 49.978 |
| 0.19677083333333334 | 49.976 |
| 0.1967824074074074 | 49.976 |
| 0.1967939814814815 | 49.976 |
| 0.19680555555555557 | 49.977 |
| 0.19681712962962963 | 49.978 |
| 0.19682870370370367 | 49.979 |
| 0.1968402777777778 | 49.98 |
| 0.19685185185185183 | 49.98 |
| 0.19686342592592596 | 49.98 |
| 0.196875 | 49.977 |
| 0.19688657407407406 | 49.974 |
| 0.19689814814814813 | 49.971 |
| 0.19690972222222222 | 49.968 |
| 0.1969212962962963 | 49.966 |
| 0.19693287037037036 | 49.963 |
| 0.19694444444444445 | 49.964 |
| 0.19695601851851852 | 49.965 |
| 0.19696759259259258 | 49.966 |
| 0.19697916666666668 | 49.965 |
| 0.19699074074074074 | 49.967 |
| 0.1970023148148148 | 49.969 |
| 0.1970138888888889 | 49.968 |
| 0.19702546296296297 | 49.969 |
| 0.19703703703703704 | 49.968 |
| 0.19704861111111113 | 49.967 |
| 0.1970601851851852 | 49.964 |
| 0.19707175925925924 | 49.963 |
| 0.19708333333333336 | 49.963 |
| 0.1970949074074074 | 49.964 |
| 0.1971064814814815 | 49.966 |
| 0.19711805555555553 | 49.97 |
| 0.19712962962962963 | 49.971 |
| 0.1971412037037037 | 49.969 |
| 0.19715277777777776 | 49.969 |
| 0.19716435185185185 | 49.968 |
| 0.19717592592592592 | 49.966 |
| 0.1971875 | 49.963 |
| 0.19719907407407408 | 49.959 |
| 0.19721064814814815 | 49.955 |
| 0.19722222222222222 | 49.953 |
| 0.1972337962962963 | 49.955 |
| 0.19724537037037038 | 49.957 |
| 0.19725694444444444 | 49.96 |
| 0.19726851851851854 | 49.963 |
| 0.1972800925925926 | 49.965 |
| 0.19729166666666667 | 49.966 |
| 0.19730324074074077 | 49.966 |
| 0.1973148148148148 | 49.966 |
| 0.1973263888888889 | 49.966 |
| 0.19733796296296294 | 49.963 |
| 0.19734953703703703 | 49.961 |
| 0.1973611111111111 | 49.96 |
| 0.19737268518518516 | 49.959 |
| 0.19738425925925926 | 49.959 |
| 0.19739583333333333 | 49.96 |
| 0.1974074074074074 | 49.961 |
| 0.1974189814814815 | 49.963 |
| 0.19743055555555555 | 49.965 |
| 0.19744212962962962 | 49.967 |
| 0.19745370370370371 | 49.972 |
| 0.19746527777777778 | 49.972 |
| 0.19747685185185185 | 49.972 |
| 0.19748842592592594 | 49.971 |
| 0.1975 | 49.97 |
| 0.19751157407407408 | 49.97 |
| 0.19752314814814817 | 49.969 |
| 0.19753472222222224 | 49.967 |
| 0.1975462962962963 | 49.963 |
| 0.19755787037037034 | 49.961 |
| 0.19756944444444446 | 49.959 |
| 0.1975810185185185 | 49.958 |
| 0.19759259259259257 | 49.958 |
| 0.19760416666666666 | 49.958 |
| 0.19761574074074073 | 49.959 |
| 0.1976273148148148 | 49.959 |
| 0.1976388888888889 | 49.961 |
| 0.19765046296296296 | 49.963 |
| 0.19766203703703702 | 49.966 |
| 0.19767361111111112 | 49.966 |
| 0.19768518518518519 | 49.967 |
| 0.19769675925925925 | 49.969 |
| 0.19770833333333335 | 49.971 |
| 0.1977199074074074 | 49.973 |
| 0.19773148148148148 | 49.974 |
| 0.19774305555555557 | 49.974 |
| 0.19775462962962964 | 49.974 |
| 0.1977662037037037 | 49.974 |
| 0.19777777777777775 | 49.974 |
| 0.19778935185185187 | 49.974 |
| 0.1978009259259259 | 49.973 |
| 0.19781250000000003 | 49.972 |
| 0.19782407407407407 | 49.972 |
| 0.19783564814814814 | 49.973 |
| 0.1978472222222222 | 49.976 |
| 0.1978587962962963 | 49.979 |
| 0.19787037037037036 | 49.979 |
| 0.19788194444444443 | 49.979 |
| 0.19789351851851852 | 49.977 |
| 0.1979050925925926 | 49.975 |
| 0.19791666666666666 | 49.973 |
| 0.19792824074074075 | 49.971 |
| 0.19793981481481482 | 49.969 |
| 0.19795138888888889 | 49.968 |
| 0.19796296296296298 | 49.967 |
| 0.19797453703703705 | 49.967 |
| 0.1979861111111111 | 49.969 |
| 0.1979976851851852 | 49.969 |
| 0.19800925925925927 | 49.97 |
| 0.1980208333333333 | 49.97 |
| 0.19803240740740743 | 49.97 |
| 0.19804398148148147 | 49.969 |
| 0.19805555555555557 | 49.968 |
| 0.1980671296296296 | 49.967 |
| 0.1980787037037037 | 49.967 |
| 0.19809027777777777 | 49.968 |
| 0.19810185185185183 | 49.971 |
| 0.19811342592592593 | 49.973 |
| 0.198125 | 49.975 |
| 0.19813657407407406 | 49.975 |
| 0.19814814814814816 | 49.975 |
| 0.19815972222222222 | 49.975 |
| 0.1981712962962963 | 49.974 |
| 0.19818287037037038 | 49.975 |
| 0.19819444444444445 | 49.976 |
| 0.19820601851851852 | 49.974 |
| 0.1982175925925926 | 49.972 |
| 0.19822916666666668 | 49.972 |
| 0.19824074074074075 | 49.972 |
| 0.19825231481481484 | 49.974 |
| 0.19826388888888888 | 49.975 |
| 0.19827546296296297 | 49.977 |
| 0.198287037037037 | 49.977 |
| 0.1982986111111111 | 49.978 |
| 0.19831018518518517 | 49.977 |
| 0.19832175925925924 | 49.975 |
| 0.19833333333333333 | 49.972 |
| 0.1983449074074074 | 49.969 |
| 0.19835648148148147 | 49.967 |
| 0.19836805555555556 | 49.964 |
| 0.19837962962962963 | 49.962 |
| 0.1983912037037037 | 49.961 |
| 0.1984027777777778 | 49.959 |
| 0.19841435185185186 | 49.959 |
| 0.19842592592592592 | 49.96 |
| 0.19843750000000002 | 49.967 |
| 0.19844907407407408 | 49.976 |
| 0.19846064814814815 | 49.985 |
| 0.19847222222222224 | 49.991 |
| 0.1984837962962963 | 49.995 |
| 0.19849537037037038 | 49.996 |
| 0.19850694444444442 | 49.994 |
| 0.19851851851851854 | 49.992 |
| 0.19853009259259258 | 49.988 |
| 0.19854166666666664 | 49.983 |
| 0.19855324074074074 | 49.979 |
| 0.1985648148148148 | 49.973 |
| 0.19857638888888887 | 49.97 |
| 0.19858796296296297 | 49.968 |
| 0.19859953703703703 | 49.966 |
| 0.1986111111111111 | 49.966 |
| 0.1986226851851852 | 49.968 |
| 0.19863425925925926 | 49.969 |
| 0.19864583333333333 | 49.97 |
| 0.19865740740740742 | 49.969 |
| 0.1986689814814815 | 49.967 |
| 0.19868055555555555 | 49.967 |
| 0.19869212962962965 | 49.965 |
| 0.19870370370370372 | 49.964 |
| 0.19871527777777778 | 49.961 |
| 0.19872685185185182 | 49.958 |
| 0.19873842592592594 | 49.956 |
| 0.19874999999999998 | 49.955 |
| 0.1987615740740741 | 49.959 |
| 0.19877314814814814 | 49.962 |
| 0.1987847222222222 | 49.965 |
| 0.19879629629629628 | 49.967 |
| 0.19880787037037037 | 49.968 |
| 0.19881944444444444 | 49.969 |
| 0.1988310185185185 | 49.971 |
| 0.1988425925925926 | 49.971 |
| 0.19885416666666667 | 49.967 |
| 0.19886574074074073 | 49.965 |
| 0.19887731481481483 | 49.964 |
| 0.1988888888888889 | 49.965 |
| 0.19890046296296296 | 49.967 |
| 0.19891203703703705 | 49.968 |
| 0.19892361111111112 | 49.967 |
| 0.1989351851851852 | 49.967 |
| 0.19894675925925928 | 49.968 |
| 0.19895833333333335 | 49.97 |
| 0.1989699074074074 | 49.973 |
| 0.1989814814814815 | 49.977 |
| 0.19899305555555555 | 49.978 |
| 0.19900462962962964 | 49.979 |
| 0.19901620370370368 | 49.979 |
| 0.19902777777777778 | 49.978 |
| 0.19903935185185184 | 49.978 |
| 0.1990509259259259 | 49.977 |
| 0.1990625 | 49.974 |
| 0.19907407407407407 | 49.971 |
| 0.19908564814814814 | 49.968 |
| 0.19909722222222223 | 49.966 |
| 0.1991087962962963 | 49.965 |
| 0.19912037037037036 | 49.964 |
| 0.19913194444444446 | 49.964 |
| 0.19914351851851853 | 49.964 |
| 0.1991550925925926 | 49.963 |
| 0.1991666666666667 | 49.965 |
| 0.19917824074074075 | 49.966 |
| 0.19918981481481482 | 49.967 |
| 0.19920138888888891 | 49.969 |
| 0.19921296296296295 | 49.972 |
| 0.19922453703703705 | 49.977 |
| 0.19923611111111109 | 49.982 |
| 0.19924768518518518 | 49.985 |
| 0.19925925925925925 | 49.986 |
| 0.1992708333333333 | 49.988 |
| 0.1992824074074074 | 49.992 |
| 0.19929398148148147 | 49.995 |
| 0.19930555555555554 | 49.997 |
| 0.19931712962962964 | 49.983 |
| 0.1993287037037037 | 49.994 |
| 0.19934027777777777 | 49.99 |
| 0.19935185185185186 | 49.986 |
| 0.19936342592592593 | 49.982 |
| 0.199375 | 49.982 |
| 0.1993865740740741 | 49.984 |
| 0.19939814814814816 | 49.985 |
| 0.19940972222222222 | 49.986 |
| 0.19942129629629632 | 49.987 |
| 0.19943287037037036 | 49.988 |
| 0.19944444444444445 | 49.987 |
| 0.1994560185185185 | 49.987 |
| 0.1994675925925926 | 49.988 |
| 0.19947916666666665 | 49.99 |
| 0.19949074074074072 | 49.991 |
| 0.1995023148148148 | 49.991 |
| 0.19951388888888888 | 49.992 |
| 0.19952546296296295 | 49.993 |
| 0.19953703703703704 | 49.994 |
| 0.1995486111111111 | 49.994 |
| 0.19956018518518517 | 49.993 |
| 0.19957175925925927 | 49.992 |
| 0.19958333333333333 | 49.992 |
| 0.1995949074074074 | 49.991 |
| 0.1996064814814815 | 49.991 |
| 0.19961805555555556 | 49.991 |
| 0.19962962962962963 | 49.992 |
| 0.19964120370370372 | 49.994 |
| 0.1996527777777778 | 49.994 |
| 0.19966435185185186 | 49.993 |
| 0.1996759259259259 | 49.991 |
| 0.19968750000000002 | 49.989 |
| 0.19969907407407406 | 49.987 |
| 0.19971064814814818 | 49.986 |
| 0.19972222222222222 | 49.988 |
| 0.19973379629629628 | 49.99 |
| 0.19974537037037035 | 49.992 |
| 0.19975694444444445 | 49.992 |
| 0.1997685185185185 | 49.994 |
| 0.19978009259259258 | 49.993 |
| 0.19979166666666667 | 49.992 |
| 0.19980324074074074 | 49.991 |
| 0.1998148148148148 | 49.989 |
| 0.1998263888888889 | 49.989 |
| 0.19983796296296297 | 49.989 |
| 0.19984953703703703 | 49.989 |
| 0.19986111111111113 | 49.988 |
| 0.1998726851851852 | 49.985 |
| 0.19988425925925926 | 49.984 |
| 0.19989583333333336 | 49.983 |
| 0.19990740740740742 | 49.983 |
| 0.19991898148148146 | 49.984 |
| 0.19993055555555558 | 49.987 |
| 0.19994212962962962 | 49.989 |
| 0.1999537037037037 | 49.991 |
| 0.19996527777777776 | 49.993 |
| 0.19997685185185185 | 49.995 |
| 0.19998842592592592 | 49.995 |
| 0.19999999999999998 | 49.994 |
| 0.20001157407407408 | 49.994 |
| 0.20002314814814814 | 49.991 |
| 0.2000347222222222 | 49.988 |
| 0.2000462962962963 | 49.984 |
| 0.20005787037037037 | 49.983 |
| 0.20006944444444444 | 49.983 |
| 0.20008101851851853 | 49.986 |
| 0.2000925925925926 | 49.989 |
| 0.20010416666666667 | 49.993 |
| 0.20011574074074076 | 49.994 |
| 0.20012731481481483 | 49.993 |
| 0.2001388888888889 | 49.993 |
| 0.200150462962963 | 49.993 |
| 0.20016203703703703 | 49.992 |
| 0.20017361111111112 | 49.99 |
| 0.20018518518518516 | 49.988 |
| 0.20019675925925925 | 49.983 |
| 0.20020833333333332 | 49.981 |
| 0.2002199074074074 | 49.981 |
| 0.20023148148148148 | 49.983 |
| 0.20024305555555555 | 49.986 |
| 0.20025462962962962 | 49.987 |
| 0.2002662037037037 | 49.987 |
| 0.20027777777777778 | 49.986 |
| 0.20028935185185184 | 49.986 |
| 0.20030092592592594 | 49.985 |
| 0.2003125 | 49.984 |
| 0.20032407407407407 | 49.981 |
| 0.20033564814814817 | 49.979 |
| 0.20034722222222223 | 49.978 |
| 0.2003587962962963 | 49.979 |
| 0.2003703703703704 | 49.981 |
| 0.20038194444444443 | 49.981 |
| 0.20039351851851853 | 49.982 |
| 0.20040509259259257 | 49.982 |
| 0.2004166666666667 | 49.981 |
| 0.20042824074074073 | 49.982 |
| 0.2004398148148148 | 49.985 |
| 0.2004513888888889 | 49.988 |
| 0.20046296296296295 | 49.988 |
| 0.20047453703703702 | 49.987 |
| 0.20048611111111111 | 49.987 |
| 0.20049768518518518 | 49.984 |
| 0.20050925925925925 | 49.982 |
| 0.20052083333333334 | 49.979 |
| 0.2005324074074074 | 49.974 |
| 0.20054398148148148 | 49.971 |
| 0.20055555555555557 | 49.97 |
| 0.20056712962962964 | 49.971 |
| 0.2005787037037037 | 49.972 |
| 0.2005902777777778 | 49.973 |
| 0.20060185185185186 | 49.975 |
| 0.20061342592592593 | 49.976 |
| 0.20062499999999997 | 49.979 |
| 0.2006365740740741 | 49.982 |
| 0.20064814814814813 | 49.985 |
| 0.20065972222222225 | 49.986 |
| 0.2006712962962963 | 49.988 |
| 0.20068287037037036 | 49.99 |
| 0.20069444444444443 | 49.993 |
| 0.20070601851851852 | 49.994 |
| 0.2007175925925926 | 49.993 |
| 0.20072916666666665 | 49.994 |
| 0.20074074074074075 | 49.992 |
| 0.20075231481481481 | 49.991 |
| 0.20076388888888888 | 49.992 |
| 0.20077546296296298 | 49.994 |
| 0.20078703703703704 | 49.996 |
| 0.2007986111111111 | 49.998 |
| 0.2008101851851852 | 50 |
| 0.20082175925925927 | 50.002 |
| 0.20083333333333334 | 50.003 |
| 0.20084490740740743 | 50.006 |
| 0.2008564814814815 | 50.008 |
| 0.20086805555555554 | 50.008 |
| 0.20087962962962966 | 50.006 |
| 0.2008912037037037 | 50.006 |
| 0.20090277777777776 | 50.006 |
| 0.20091435185185183 | 50.006 |
| 0.20092592592592592 | 50.005 |
| 0.2009375 | 50.006 |
| 0.20094907407407406 | 50.009 |
| 0.20096064814814815 | 50.01 |
| 0.20097222222222222 | 50.014 |
| 0.20098379629629629 | 50.015 |
| 0.20099537037037038 | 50.016 |
| 0.20100694444444445 | 50.015 |
| 0.2010185185185185 | 50.016 |
| 0.2010300925925926 | 50.015 |
| 0.20104166666666667 | 50.015 |
| 0.20105324074074074 | 50.013 |
| 0.20106481481481484 | 50.011 |
| 0.2010763888888889 | 50.009 |
| 0.20108796296296297 | 50.008 |
| 0.20109953703703706 | 50.006 |
| 0.2011111111111111 | 50.005 |
| 0.2011226851851852 | 50.005 |
| 0.20113425925925923 | 50.004 |
| 0.20114583333333333 | 50.002 |
| 0.2011574074074074 | 50 |
| 0.20116898148148146 | 49.997 |
| 0.20118055555555556 | 49.994 |
| 0.20119212962962962 | 49.992 |
| 0.2012037037037037 | 49.991 |
| 0.20121527777777778 | 49.991 |
| 0.20122685185185185 | 49.993 |
| 0.20123842592592592 | 49.995 |
| 0.20125 | 49.995 |
| 0.20126157407407408 | 49.995 |
| 0.20127314814814815 | 49.993 |
| 0.20128472222222224 | 49.99 |
| 0.2012962962962963 | 49.988 |
| 0.20130787037037037 | 49.985 |
| 0.20131944444444447 | 49.985 |
| 0.2013310185185185 | 49.986 |
| 0.2013425925925926 | 49.987 |
| 0.20135416666666664 | 49.988 |
| 0.20136574074074076 | 49.988 |
| 0.2013773148148148 | 49.987 |